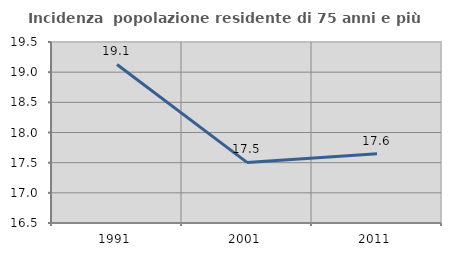
| Category | Incidenza  popolazione residente di 75 anni e più |
|---|---|
| 1991.0 | 19.128 |
| 2001.0 | 17.505 |
| 2011.0 | 17.647 |